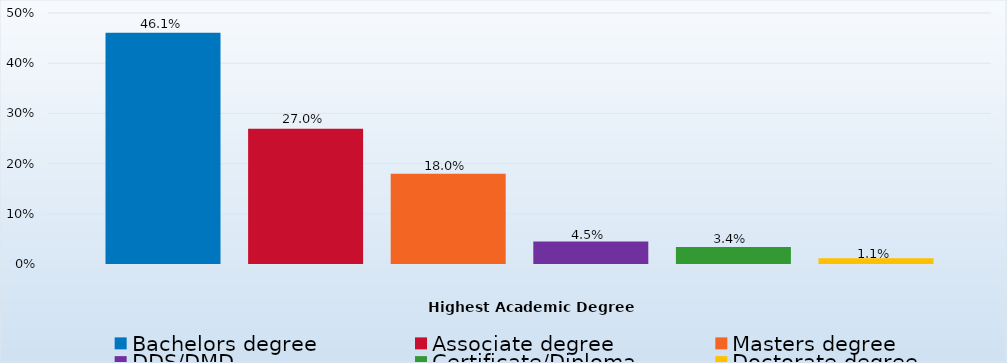
| Category | Bachelors degree | Associate degree | Masters degree | DDS/DMD | Certificate/Diploma | Doctorate degree |
|---|---|---|---|---|---|---|
| Percent | 0.461 | 0.27 | 0.18 | 0.045 | 0.034 | 0.011 |